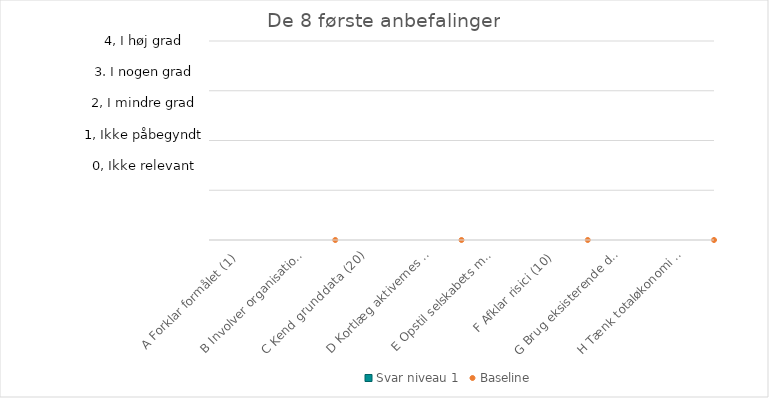
| Category | Svar niveau 1 |
|---|---|
| A Forklar formålet (1) | 0 |
| B Involver organisationen (2) | 0 |
| C Kend grunddata (20) | 0 |
| D Kortlæg aktivernes tilstand (6) | 0 |
| E Opstil selskabets mål (8) | 0 |
| F Afklar risici (10) | 0 |
| G Brug eksisterende data (21) | 0 |
| H Tænk totaløkonomi  (12) | 0 |